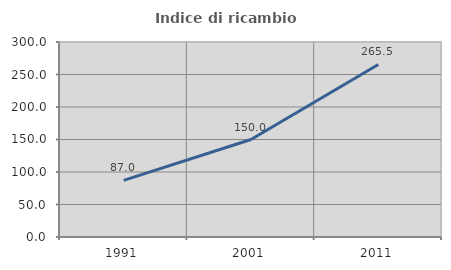
| Category | Indice di ricambio occupazionale  |
|---|---|
| 1991.0 | 87.037 |
| 2001.0 | 150 |
| 2011.0 | 265.476 |